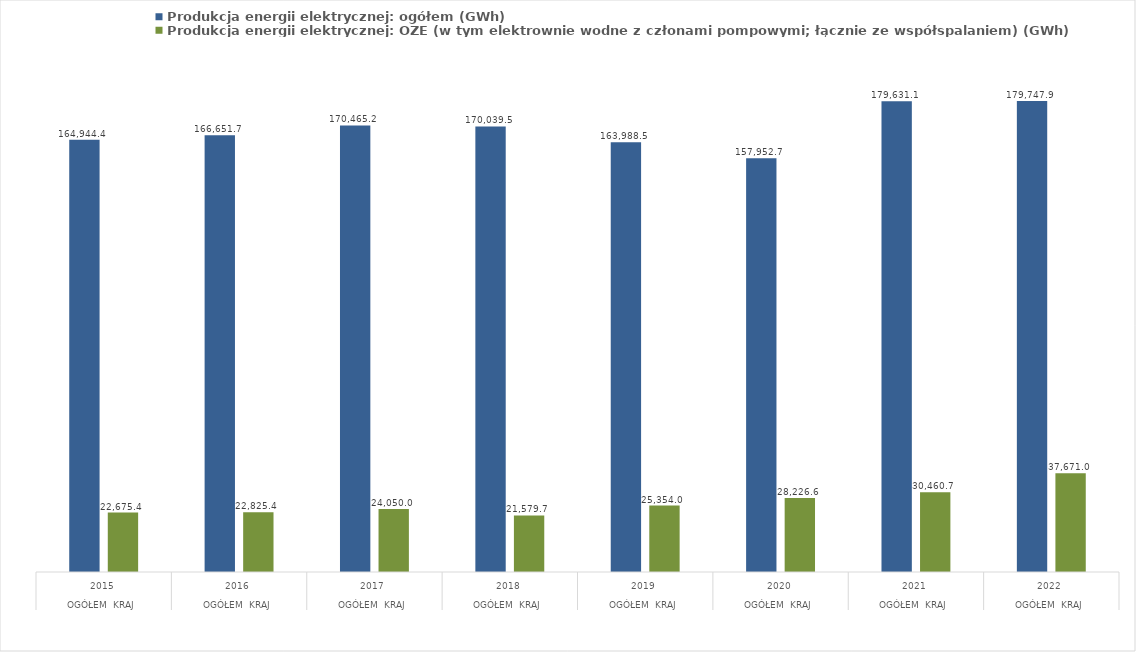
| Category | Produkcja energii elektrycznej: ogółem (GWh) | Produkcja energii elektrycznej: OZE (w tym elektrownie wodne z członami pompowymi; łącznie ze współspalaniem) (GWh) |
|---|---|---|
| 0 | 164944.374 | 22675.4 |
| 1 | 166651.74 | 22825.36 |
| 2 | 170465.228 | 24050.02 |
| 3 | 170039.461 | 21579.69 |
| 4 | 163988.546 | 25353.99 |
| 5 | 157952.688 | 28226.56 |
| 6 | 179631.053 | 30460.701 |
| 7 | 179747.88 | 37671.041 |